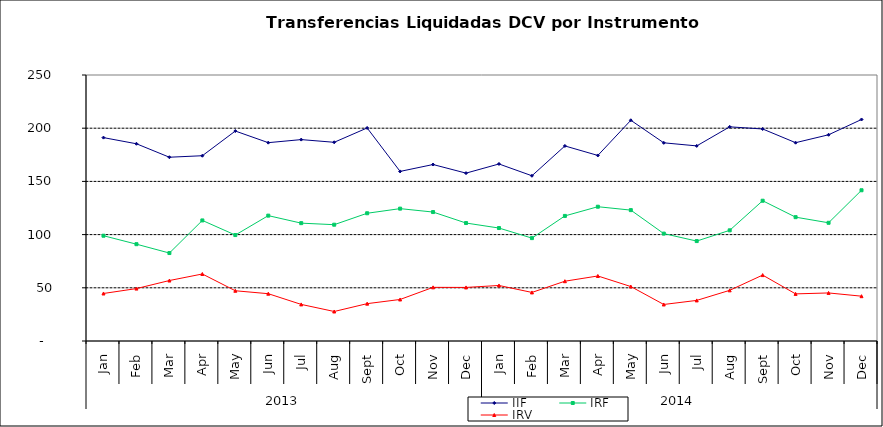
| Category | IIF | IRF | IRV |
|---|---|---|---|
| 0 | 191.156 | 98.94 | 44.662 |
| 1900-01-01 | 185.364 | 90.997 | 49.257 |
| 1900-01-02 | 172.715 | 82.663 | 56.835 |
| 1900-01-03 | 174.136 | 113.314 | 62.972 |
| 1900-01-04 | 197.339 | 99.565 | 47.217 |
| 1900-01-05 | 186.405 | 117.833 | 44.452 |
| 1900-01-06 | 189.291 | 110.761 | 34.391 |
| 1900-01-07 | 186.753 | 109.306 | 27.738 |
| 1900-01-08 | 200.221 | 120.051 | 35.102 |
| 1900-01-09 | 159.386 | 124.412 | 39.024 |
| 1900-01-10 | 165.855 | 121.186 | 50.424 |
| 1900-01-11 | 157.768 | 110.866 | 50.342 |
| 1900-01-12 | 166.382 | 106.167 | 52.185 |
| 1900-01-13 | 155.289 | 96.688 | 45.642 |
| 1900-01-14 | 183.323 | 117.558 | 56.185 |
| 1900-01-15 | 174.391 | 126.217 | 61.113 |
| 1900-01-16 | 207.456 | 123.005 | 51.192 |
| 1900-01-17 | 186.259 | 100.942 | 34.33 |
| 1900-01-18 | 183.361 | 93.919 | 38.145 |
| 1900-01-19 | 201.286 | 104.009 | 47.615 |
| 1900-01-20 | 199.275 | 131.834 | 61.946 |
| 1900-01-21 | 186.394 | 116.389 | 44.29 |
| 1900-01-22 | 193.804 | 111.107 | 45.171 |
| 1900-01-23 | 208.194 | 141.67 | 42.129 |